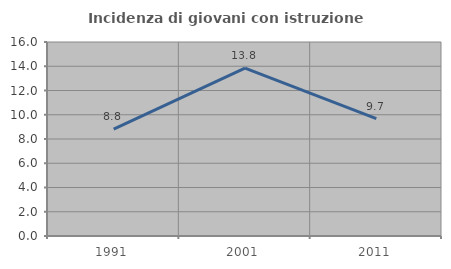
| Category | Incidenza di giovani con istruzione universitaria |
|---|---|
| 1991.0 | 8.824 |
| 2001.0 | 13.846 |
| 2011.0 | 9.677 |